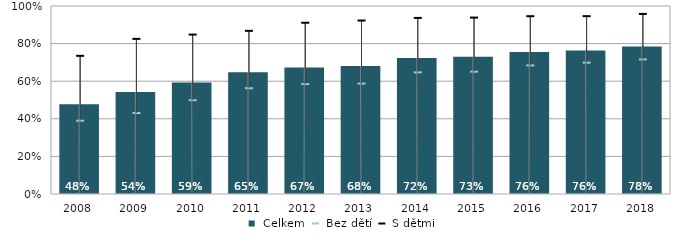
| Category |  Celkem |
|---|---|
| 2008.0 | 0.477 |
| 2009.0 | 0.542 |
| 2010.0 | 0.593 |
| 2011.0 | 0.648 |
| 2012.0 | 0.673 |
| 2013.0 | 0.681 |
| 2014.0 | 0.724 |
| 2015.0 | 0.731 |
| 2016.0 | 0.756 |
| 2017.0 | 0.763 |
| 2018.0 | 0.784 |